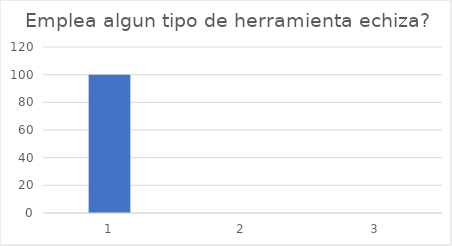
| Category | Emplea algun tipo de herramienta echiza? |
|---|---|
| 0 | 100 |
| 1 | 0 |
| 2 | 0 |